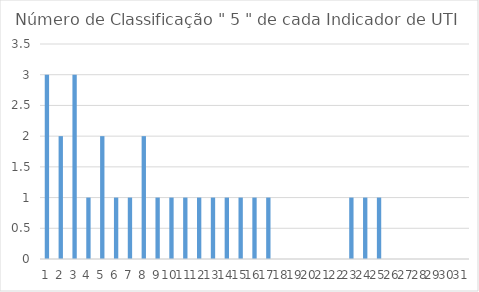
| Category | Series 0 |
|---|---|
| 0 | 3 |
| 1 | 2 |
| 2 | 3 |
| 3 | 1 |
| 4 | 2 |
| 5 | 1 |
| 6 | 1 |
| 7 | 2 |
| 8 | 1 |
| 9 | 1 |
| 10 | 1 |
| 11 | 1 |
| 12 | 1 |
| 13 | 1 |
| 14 | 1 |
| 15 | 1 |
| 16 | 1 |
| 17 | 0 |
| 18 | 0 |
| 19 | 0 |
| 20 | 0 |
| 21 | 0 |
| 22 | 1 |
| 23 | 1 |
| 24 | 1 |
| 25 | 0 |
| 26 | 0 |
| 27 | 0 |
| 28 | 0 |
| 29 | 0 |
| 30 | 0 |